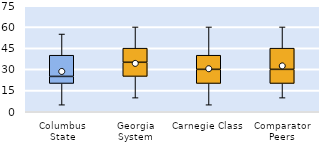
| Category | 25th | 50th | 75th |
|---|---|---|---|
| Columbus State | 20 | 5 | 15 |
| Georgia System | 25 | 10 | 10 |
| Carnegie Class | 20 | 10 | 10 |
| Comparator Peers | 20 | 10 | 15 |